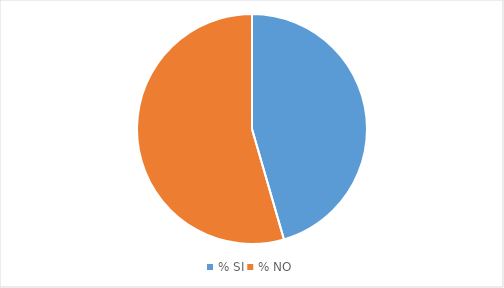
| Category | Series 0 | Series 1 | Series 2 | Series 3 | Series 4 | Series 5 | Series 6 | Series 7 | Series 8 | Series 9 |
|---|---|---|---|---|---|---|---|---|---|---|
| % SI | 2.13 | 3.83 | 6.81 | 5.96 | 11.06 | 8.09 | 12.76 | 2.98 | 2.55 | 5.53 |
| % NO | 2.55 | 2.55 | 5.11 | 3.83 | 3.4 | 5.11 | 2.98 | 2.98 | 3.83 | 5.96 |